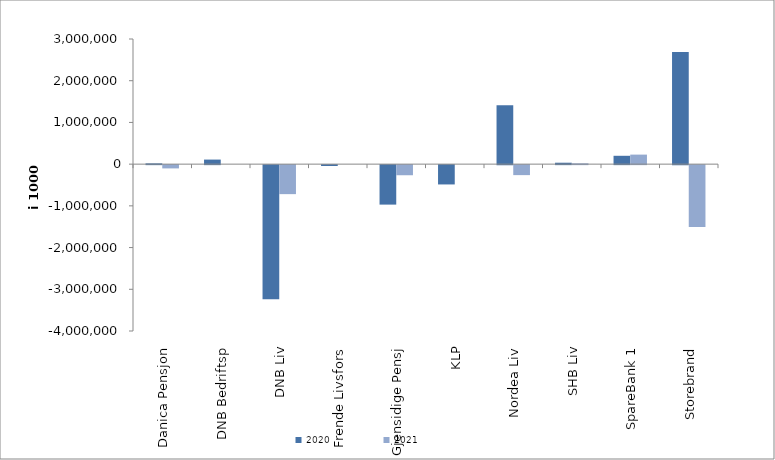
| Category | 2020 | 2021 |
|---|---|---|
| Danica Pensjon | 19242.993 | -78093.287 |
| DNB Bedriftsp | 109462 | 0 |
| DNB Liv | -3215694 | -694987 |
| Frende Livsfors | -20540 | 0 |
| Gjensidige Pensj | -946156 | -241966 |
| KLP | -462765.726 | 0 |
| Nordea Liv | 1409300.004 | -239181.37 |
| SHB Liv | 34179.303 | 20557.493 |
| SpareBank 1 | 200254.901 | 228488.247 |
| Storebrand | 2686212.682 | -1480369.3 |